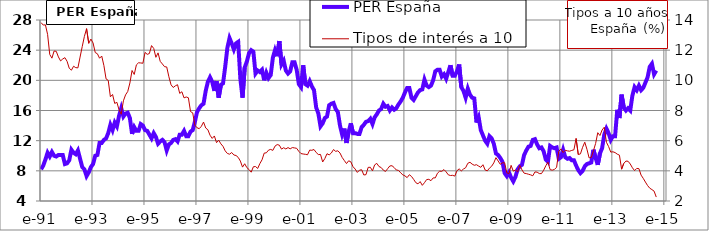
| Category | PER España |
|---|---|
| 1991-01-01 | 8.2 |
| 1991-02-01 | 8.7 |
| 1991-03-01 | 9.5 |
| 1991-04-01 | 10.4 |
| 1991-05-01 | 9.9 |
| 1991-06-01 | 10.5 |
| 1991-07-01 | 10 |
| 1991-08-01 | 9.9 |
| 1991-09-01 | 10.1 |
| 1991-10-01 | 10.1 |
| 1991-11-01 | 10.1 |
| 1991-12-01 | 8.9 |
| 1992-01-01 | 9 |
| 1992-02-01 | 9.4 |
| 1992-03-01 | 10.8 |
| 1992-04-01 | 10.4 |
| 1992-05-01 | 10.2 |
| 1992-06-01 | 10.7 |
| 1992-07-01 | 9.6 |
| 1992-08-01 | 8.5 |
| 1992-09-01 | 8.2 |
| 1992-10-01 | 7.3 |
| 1992-11-01 | 7.8 |
| 1992-12-01 | 8.5 |
| 1993-01-01 | 8.9 |
| 1993-02-01 | 10 |
| 1993-03-01 | 10.1 |
| 1993-04-01 | 11.7 |
| 1993-05-01 | 11.7 |
| 1993-06-01 | 12.1 |
| 1993-07-01 | 12.3 |
| 1993-08-01 | 13 |
| 1993-09-01 | 14.1 |
| 1993-10-01 | 13.4 |
| 1993-11-01 | 14.4 |
| 1993-12-01 | 13.9 |
| 1994-01-01 | 15.3 |
| 1994-02-01 | 16.3 |
| 1994-03-01 | 15.2 |
| 1994-04-01 | 15.6 |
| 1994-05-01 | 15.7 |
| 1994-06-01 | 15 |
| 1994-07-01 | 12.9 |
| 1994-08-01 | 13.8 |
| 1994-09-01 | 13.3 |
| 1994-10-01 | 13.3 |
| 1994-11-01 | 14.2 |
| 1994-12-01 | 14 |
| 1995-01-01 | 13.4 |
| 1995-02-01 | 13.3 |
| 1995-03-01 | 12.8 |
| 1995-04-01 | 12.3 |
| 1995-05-01 | 13 |
| 1995-06-01 | 12.5 |
| 1995-07-01 | 11.6 |
| 1995-08-01 | 11.9 |
| 1995-09-01 | 12.1 |
| 1995-10-01 | 11.8 |
| 1995-11-01 | 10.7 |
| 1995-12-01 | 11.5 |
| 1996-01-01 | 11.7 |
| 1996-02-01 | 12.1 |
| 1996-03-01 | 12.2 |
| 1996-04-01 | 11.9 |
| 1996-05-01 | 12.8 |
| 1996-06-01 | 12.8 |
| 1996-07-01 | 13.3 |
| 1996-08-01 | 12.6 |
| 1996-09-01 | 12.6 |
| 1996-10-01 | 13.2 |
| 1996-11-01 | 13.4 |
| 1996-12-01 | 14.5 |
| 1997-01-01 | 15.8 |
| 1997-02-01 | 16.3 |
| 1997-03-01 | 16.7 |
| 1997-04-01 | 16.9 |
| 1997-05-01 | 18.6 |
| 1997-06-01 | 19.8 |
| 1997-07-01 | 20.4 |
| 1997-08-01 | 19.8 |
| 1997-09-01 | 18.6 |
| 1997-10-01 | 19.9 |
| 1997-11-01 | 17.7 |
| 1997-12-01 | 19.4 |
| 1998-01-01 | 19.6 |
| 1998-02-01 | 21.8 |
| 1998-03-01 | 24.3 |
| 1998-04-01 | 25.6 |
| 1998-05-01 | 24.9 |
| 1998-06-01 | 24.1 |
| 1998-07-01 | 24.9 |
| 1998-08-01 | 25.1 |
| 1998-09-01 | 20.2 |
| 1998-10-01 | 17.7 |
| 1998-11-01 | 21.7 |
| 1998-12-01 | 22.5 |
| 1999-01-01 | 23.6 |
| 1999-02-01 | 24 |
| 1999-03-01 | 23.8 |
| 1999-04-01 | 20.9 |
| 1999-05-01 | 21.3 |
| 1999-06-01 | 21.1 |
| 1999-07-01 | 21.4 |
| 1999-08-01 | 20 |
| 1999-09-01 | 21 |
| 1999-10-01 | 20.3 |
| 1999-11-01 | 20.7 |
| 1999-12-01 | 23 |
| 2000-01-01 | 24 |
| 2000-02-01 | 23.2 |
| 2000-03-01 | 25.2 |
| 2000-04-01 | 22.1 |
| 2000-05-01 | 22.6 |
| 2000-06-01 | 21.3 |
| 2000-07-01 | 20.9 |
| 2000-08-01 | 21.2 |
| 2000-09-01 | 22.4 |
| 2000-10-01 | 22.4 |
| 2000-11-01 | 21.4 |
| 2000-12-01 | 19.5 |
| 2001-01-01 | 19.1 |
| 2001-02-01 | 22 |
| 2001-03-01 | 19.5 |
| 2001-04-01 | 19.3 |
| 2001-05-01 | 19.9 |
| 2001-06-01 | 19.2 |
| 2001-07-01 | 18.7 |
| 2001-08-01 | 16.4 |
| 2001-09-01 | 15.6 |
| 2001-10-01 | 13.9 |
| 2001-11-01 | 14.3 |
| 2001-12-01 | 15 |
| 2002-01-01 | 15.2 |
| 2002-02-01 | 16.7 |
| 2002-03-01 | 16.9 |
| 2002-04-01 | 17 |
| 2002-05-01 | 16.2 |
| 2002-06-01 | 15.8 |
| 2002-07-01 | 14 |
| 2002-08-01 | 12.8 |
| 2002-09-01 | 13.6 |
| 2002-10-01 | 11.7 |
| 2002-11-01 | 13.2 |
| 2002-12-01 | 14.3 |
| 2003-01-01 | 13 |
| 2003-02-01 | 13 |
| 2003-03-01 | 12.9 |
| 2003-04-01 | 12.9 |
| 2003-05-01 | 13.8 |
| 2003-06-01 | 14.1 |
| 2003-07-01 | 14.5 |
| 2003-08-01 | 14.6 |
| 2003-09-01 | 14.9 |
| 2003-10-01 | 14.2 |
| 2003-11-01 | 15.1 |
| 2003-12-01 | 15.5 |
| 2004-01-01 | 16 |
| 2004-02-01 | 16.2 |
| 2004-03-01 | 16.9 |
| 2004-04-01 | 16.5 |
| 2004-05-01 | 16.6 |
| 2004-06-01 | 16 |
| 2004-07-01 | 16.4 |
| 2004-08-01 | 16.1 |
| 2004-09-01 | 16.3 |
| 2004-10-01 | 16.8 |
| 2004-11-01 | 17.2 |
| 2004-12-01 | 17.7 |
| 2005-01-01 | 18.4 |
| 2005-02-01 | 19 |
| 2005-03-01 | 19 |
| 2005-04-01 | 17.7 |
| 2005-05-01 | 17.4 |
| 2005-06-01 | 17.9 |
| 2005-07-01 | 18.4 |
| 2005-08-01 | 18.7 |
| 2005-09-01 | 18.8 |
| 2005-10-01 | 20.1 |
| 2005-11-01 | 19.3 |
| 2005-12-01 | 19.1 |
| 2006-01-01 | 19.3 |
| 2006-02-01 | 20 |
| 2006-03-01 | 21.2 |
| 2006-04-01 | 21.4 |
| 2006-05-01 | 21.4 |
| 2006-06-01 | 20.5 |
| 2006-07-01 | 20.8 |
| 2006-08-01 | 20.2 |
| 2006-09-01 | 21.1 |
| 2006-10-01 | 22 |
| 2006-11-01 | 20.6 |
| 2006-12-01 | 20.6 |
| 2007-01-01 | 21.2 |
| 2007-02-01 | 22.1 |
| 2007-03-01 | 19.1 |
| 2007-04-01 | 18.6 |
| 2007-05-01 | 17.7 |
| 2007-06-01 | 18.9 |
| 2007-07-01 | 18.1 |
| 2007-08-01 | 17.7 |
| 2007-09-01 | 17.6 |
| 2007-10-01 | 14.4 |
| 2007-11-01 | 15.1 |
| 2007-12-01 | 13.4 |
| 2008-01-01 | 12.7 |
| 2008-02-01 | 12 |
| 2008-03-01 | 11.6 |
| 2008-04-01 | 12.6 |
| 2008-05-01 | 12.3 |
| 2008-06-01 | 11.6 |
| 2008-07-01 | 10.3 |
| 2008-08-01 | 10.1 |
| 2008-09-01 | 9.7 |
| 2008-10-01 | 9.2 |
| 2008-11-01 | 7.7 |
| 2008-12-01 | 7.3 |
| 2009-01-01 | 7.8 |
| 2009-02-01 | 7.1 |
| 2009-03-01 | 6.6 |
| 2009-04-01 | 7.2 |
| 2009-05-01 | 8.2 |
| 2009-06-01 | 8.6 |
| 2009-07-01 | 8.8 |
| 2009-08-01 | 10.1 |
| 2009-09-01 | 10.7 |
| 2009-10-01 | 11.2 |
| 2009-11-01 | 11.3 |
| 2009-12-01 | 12.1 |
| 2010-01-01 | 12.2 |
| 2010-02-01 | 11.5 |
| 2010-03-01 | 11 |
| 2010-04-01 | 11.1 |
| 2010-05-01 | 10.6 |
| 2010-06-01 | 9.5 |
| 2010-07-01 | 9.2 |
| 2010-08-01 | 11.3 |
| 2010-09-01 | 11.1 |
| 2010-10-01 | 11 |
| 2010-11-01 | 11.1 |
| 2010-12-01 | 9.6 |
| 2011-01-01 | 9.8 |
| 2011-02-01 | 10.8 |
| 2011-03-01 | 9.8 |
| 2011-04-01 | 9.6 |
| 2011-05-01 | 9.7 |
| 2011-06-01 | 9.4 |
| 2011-07-01 | 9.4 |
| 2011-08-01 | 8.7 |
| 2011-09-01 | 8.1 |
| 2011-10-01 | 7.7 |
| 2011-11-01 | 8 |
| 2011-12-01 | 8.6 |
| 2012-01-01 | 8.9 |
| 2012-02-01 | 9 |
| 2012-03-01 | 9.1 |
| 2012-04-01 | 10.8 |
| 2012-05-01 | 9.7 |
| 2012-06-01 | 8.8 |
| 2012-07-01 | 10.3 |
| 2012-08-01 | 11 |
| 2012-09-01 | 12.8 |
| 2012-10-01 | 13.6 |
| 2012-11-01 | 13 |
| 2012-12-01 | 12.1 |
| 2013-01-01 | 12.6 |
| 2013-02-01 | 12.6 |
| 2013-03-01 | 16.1 |
| 2013-04-01 | 15 |
| 2013-05-01 | 18.1 |
| 2013-06-01 | 16.4 |
| 2013-07-01 | 16 |
| 2013-08-01 | 16.3 |
| 2013-09-01 | 16 |
| 2013-10-01 | 18 |
| 2013-11-01 | 19.1 |
| 2013-12-01 | 18.7 |
| 2014-01-01 | 19.3 |
| 2014-02-01 | 18.7 |
| 2014-03-01 | 19 |
| 2014-04-01 | 19.7 |
| 2014-05-01 | 20.4 |
| 2014-06-01 | 21.8 |
| 2014-07-01 | 22.2 |
| 2014-08-01 | 20.8 |
| 2014-09-01 | 21.3 |